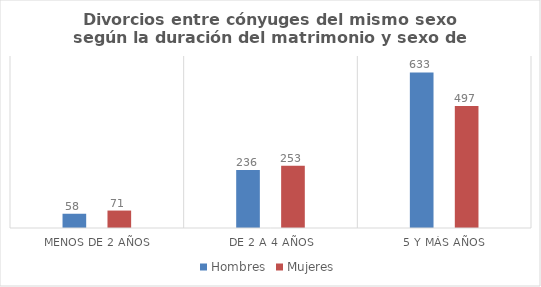
| Category | Hombres | Mujeres |
|---|---|---|
| Menos de 2 años | 58 | 71 |
| De 2 a 4 años | 236 | 253 |
| 5 y más años | 633 | 497 |